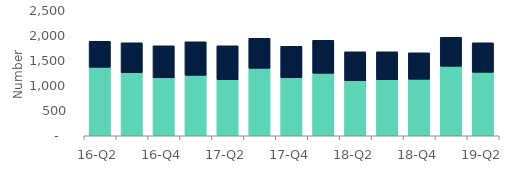
| Category | Homeowners | Buy-to-let |
|---|---|---|
| 16-Q2 | 1370 | 520 |
| 16-Q3 | 1260 | 600 |
| 16-Q4 | 1160 | 640 |
| 17-Q1 | 1210 | 670 |
| 17-Q2 | 1120 | 680 |
| 17-Q3 | 1350 | 600 |
| 17-Q4 | 1160 | 630 |
| 18-Q1 | 1250 | 660 |
| 18-Q2 | 1100 | 580 |
| 18-Q3 | 1120 | 560 |
| 18-Q4 | 1130 | 530 |
| 19-Q1 | 1390 | 580 |
| 19-Q2 | 1270 | 590 |